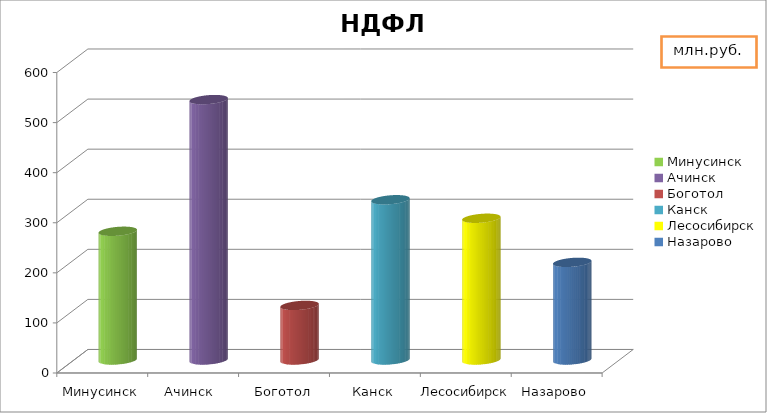
| Category | НДФЛ |
|---|---|
| Минусинск | 257 |
| Ачинск  | 520 |
| Боготол | 109 |
| Канск | 320 |
| Лесосибирск | 283 |
| Назарово | 195 |